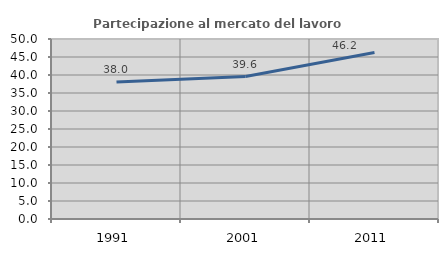
| Category | Partecipazione al mercato del lavoro  femminile |
|---|---|
| 1991.0 | 38.043 |
| 2001.0 | 39.557 |
| 2011.0 | 46.248 |